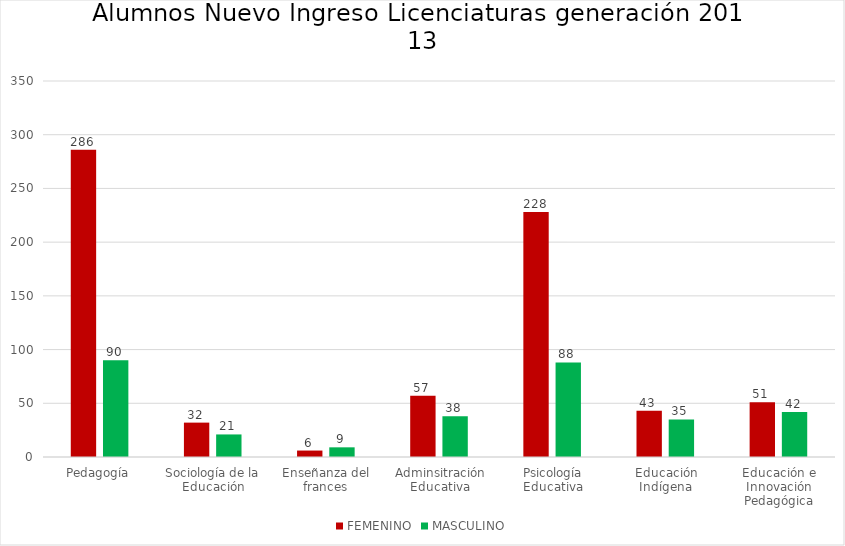
| Category | FEMENINO | MASCULINO |
|---|---|---|
| Pedagogía | 286 | 90 |
| Sociología de la Educación | 32 | 21 |
| Enseñanza del frances | 6 | 9 |
| Adminsitración Educativa | 57 | 38 |
| Psicología Educativa | 228 | 88 |
| Educación Indígena | 43 | 35 |
| Educación e Innovación Pedagógica | 51 | 42 |